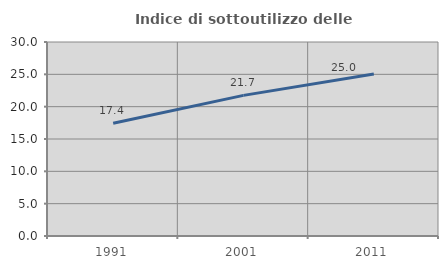
| Category | Indice di sottoutilizzo delle abitazioni  |
|---|---|
| 1991.0 | 17.442 |
| 2001.0 | 21.744 |
| 2011.0 | 25.047 |